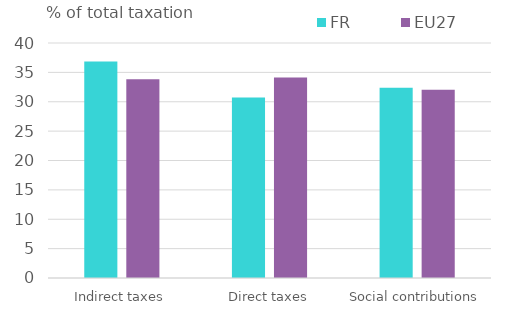
| Category | FR | EU27 |
|---|---|---|
| Indirect taxes | 36.869 | 33.811 |
| Direct taxes | 30.728 | 34.133 |
| Social contributions | 32.403 | 32.056 |